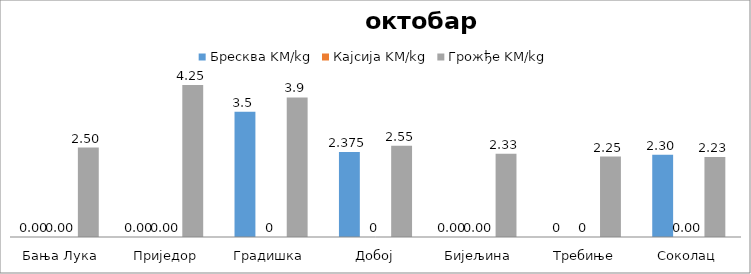
| Category | Бресква KM/kg | Кајсија KM/kg | Грожђе KM/kg |
|---|---|---|---|
| Бања Лука | 0 | 0 | 2.5 |
| Приједор | 0 | 0 | 4.25 |
| Градишка | 3.5 | 0 | 3.9 |
| Добој | 2.375 | 0 | 2.55 |
| Бијељина | 0 | 0 | 2.325 |
|  Требиње | 0 | 0 | 2.25 |
| Соколац | 2.3 | 0 | 2.233 |